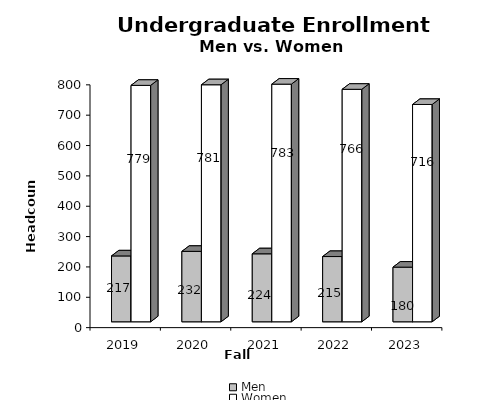
| Category | Men | Women |
|---|---|---|
| 2019.0 | 217 | 779 |
| 2020.0 | 232 | 781 |
| 2021.0 | 224 | 783 |
| 2022.0 | 215 | 766 |
| 2023.0 | 180 | 716 |